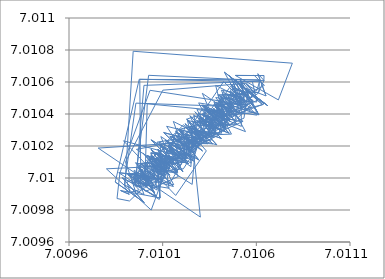
| Category | z(i+1) |
|---|---|
| 7.010587038041048 | 7.011 |
| 7.010643327215147 | 7.011 |
| 7.010578920234985 | 7.011 |
| 7.010539316386497 | 7.011 |
| 7.010529685065966 | 7.01 |
| 7.01048511235162 | 7.011 |
| 7.010531497682768 | 7.011 |
| 7.010518934696032 | 7.011 |
| 7.010608680972494 | 7.01 |
| 7.010486922249727 | 7.01 |
| 7.010425552691462 | 7.011 |
| 7.010510290310243 | 7.01 |
| 7.010467754568153 | 7.011 |
| 7.0105342815099245 | 7.01 |
| 7.010482627822763 | 7.011 |
| 7.010520934503475 | 7.01 |
| 7.0104550334090545 | 7.01 |
| 7.010437948309654 | 7.01 |
| 7.010395726426616 | 7.01 |
| 7.010433253508828 | 7.01 |
| 7.010313910743665 | 7.01 |
| 7.0104566181116565 | 7.01 |
| 7.010371916823228 | 7.01 |
| 7.010429063393958 | 7.01 |
| 7.010368888384199 | 7.01 |
| 7.010298493454005 | 7.01 |
| 7.010246157922763 | 7.01 |
| 7.010389206918105 | 7.01 |
| 7.01020742385024 | 7.01 |
| 7.010264531420542 | 7.01 |
| 7.010105466889015 | 7.01 |
| 7.010283849636569 | 7.01 |
| 7.010228531307917 | 7.01 |
| 7.010138480833361 | 7.01 |
| 7.010169743061649 | 7.01 |
| 7.010279718385664 | 7.01 |
| 7.010257574999105 | 7.01 |
| 7.009959973471053 | 7.01 |
| 7.0101787238343904 | 7.01 |
| 7.010229509519602 | 7.01 |
| 7.010223253593631 | 7.01 |
| 7.010108894947646 | 7.01 |
| 7.010120699438486 | 7.01 |
| 7.010145207186079 | 7.01 |
| 7.010187337129556 | 7.01 |
| 7.0100892254917175 | 7.01 |
| 7.010098729639178 | 7.01 |
| 7.010141625344139 | 7.01 |
| 7.010077050707058 | 7.01 |
| 7.009937034837109 | 7.01 |
| 7.009976632146876 | 7.01 |
| 7.010053858964201 | 7.01 |
| 7.009955797058401 | 7.01 |
| 7.0100953105103 | 7.01 |
| 7.010047977047843 | 7.01 |
| 7.010070786928096 | 7.01 |
| 7.009924279627846 | 7.01 |
| 7.010022615783295 | 7.01 |
| 7.010006004766696 | 7.01 |
| 7.009958281921703 | 7.01 |
| 7.010024969775642 | 7.011 |
| 7.010641812797588 | 7.011 |
| 7.01060824835951 | 7.011 |
| 7.01065153703241 | 7.011 |
| 7.010513093086659 | 7.011 |
| 7.010574665085311 | 7.01 |
| 7.010482926860968 | 7.01 |
| 7.01046231978634 | 7.011 |
| 7.010519935114501 | 7.01 |
| 7.010466435515652 | 7.011 |
| 7.010583279425339 | 7.01 |
| 7.0104826519918255 | 7.01 |
| 7.010399463564785 | 7.01 |
| 7.010387724492041 | 7.01 |
| 7.010348858879402 | 7.01 |
| 7.010335392361106 | 7.01 |
| 7.010373603038712 | 7.01 |
| 7.0104369377103986 | 7.01 |
| 7.010302820439571 | 7.01 |
| 7.010231185524427 | 7.01 |
| 7.010369226284913 | 7.01 |
| 7.0104190671301145 | 7.01 |
| 7.0103001905441955 | 7.01 |
| 7.010332700625465 | 7.01 |
| 7.0104228516629155 | 7.01 |
| 7.010398788200551 | 7.01 |
| 7.010267705521836 | 7.01 |
| 7.010194156969123 | 7.01 |
| 7.010305459843556 | 7.01 |
| 7.010338911100393 | 7.01 |
| 7.0103216852489805 | 7.01 |
| 7.01029991531808 | 7.01 |
| 7.01027045923402 | 7.01 |
| 7.010304170550452 | 7.01 |
| 7.010226123268269 | 7.01 |
| 7.010232419337659 | 7.01 |
| 7.010294975623724 | 7.01 |
| 7.01021044683564 | 7.01 |
| 7.010057297098649 | 7.01 |
| 7.010036677768495 | 7.01 |
| 7.010158440049685 | 7.01 |
| 7.010126760980391 | 7.01 |
| 7.01009373981963 | 7.01 |
| 7.010088687488498 | 7.01 |
| 7.010038056587904 | 7.01 |
| 7.010155118085034 | 7.01 |
| 7.01012982551234 | 7.01 |
| 7.0101021996781965 | 7.01 |
| 7.010037829703696 | 7.01 |
| 7.010139984423158 | 7.01 |
| 7.010057530030242 | 7.01 |
| 7.01008054565539 | 7.01 |
| 7.010033147304555 | 7.01 |
| 7.010092876875664 | 7.01 |
| 7.010060486070184 | 7.01 |
| 7.009956200502049 | 7.01 |
| 7.009948002367624 | 7.01 |
| 7.010048667717958 | 7.01 |
| 7.00996831956194 | 7.01 |
| 7.010000802879566 | 7.01 |
| 7.009895566122015 | 7.01 |
| 7.009957094622581 | 7.01 |
| 7.010467947735872 | 7.01 |
| 7.010446881885459 | 7.011 |
| 7.010518820720169 | 7.01 |
| 7.010492231214578 | 7.011 |
| 7.0106125244444 | 7.01 |
| 7.010396300379371 | 7.01 |
| 7.010481422437366 | 7.01 |
| 7.010396290194616 | 7.01 |
| 7.010462723295965 | 7.011 |
| 7.010574157080678 | 7.01 |
| 7.010444024154563 | 7.01 |
| 7.01036392164641 | 7.01 |
| 7.010398182994527 | 7.01 |
| 7.010445698766001 | 7.01 |
| 7.010381496185571 | 7.01 |
| 7.010461108375663 | 7.01 |
| 7.010431242860154 | 7.01 |
| 7.010314656450992 | 7.01 |
| 7.010403743802617 | 7.01 |
| 7.01029950012435 | 7.01 |
| 7.010385063862097 | 7.01 |
| 7.010305251439538 | 7.01 |
| 7.010312150979389 | 7.01 |
| 7.010292927279273 | 7.01 |
| 7.010372635589984 | 7.01 |
| 7.010252792736317 | 7.01 |
| 7.010311271639136 | 7.01 |
| 7.010272013853997 | 7.01 |
| 7.010311961047101 | 7.01 |
| 7.01021482289618 | 7.01 |
| 7.0101383302736755 | 7.01 |
| 7.010261967664402 | 7.01 |
| 7.010181341588 | 7.01 |
| 7.010130731523006 | 7.01 |
| 7.010219634457745 | 7.01 |
| 7.010156897437225 | 7.01 |
| 7.010353413669293 | 7.01 |
| 7.010237776401327 | 7.01 |
| 7.010182236174942 | 7.01 |
| 7.010160400661498 | 7.01 |
| 7.010230819873296 | 7.01 |
| 7.0102499077989835 | 7.01 |
| 7.0101540883108155 | 7.01 |
| 7.010081427058132 | 7.01 |
| 7.0102249818484585 | 7.01 |
| 7.010136487767999 | 7.01 |
| 7.009963761432418 | 7.01 |
| 7.010086455646246 | 7.01 |
| 7.010109400250409 | 7.01 |
| 7.010009512378678 | 7.01 |
| 7.010070041326533 | 7.01 |
| 7.010159473037676 | 7.01 |
| 7.00995697727209 | 7.01 |
| 7.010021050483567 | 7.01 |
| 7.009991340397008 | 7.01 |
| 7.009947454520704 | 7.01 |
| 7.009956157727174 | 7.01 |
| 7.010038935917469 | 7.01 |
| 7.009995244760927 | 7.01 |
| 7.009958378540802 | 7.01 |
| 7.0100001225117134 | 7.011 |
| 7.0105790670494805 | 7.011 |
| 7.010602913480632 | 7.01 |
| 7.010475101292086 | 7.01 |
| 7.010482758505321 | 7.011 |
| 7.0105239270952255 | 7.01 |
| 7.010436580044374 | 7.011 |
| 7.010525830474387 | 7.011 |
| 7.010504507746148 | 7.01 |
| 7.010457261601039 | 7.01 |
| 7.010483238885527 | 7.01 |
| 7.01044622760072 | 7.01 |
| 7.010411808431822 | 7.01 |
| 7.010463174020064 | 7.01 |
| 7.010453641509294 | 7.01 |
| 7.010360672316951 | 7.01 |
| 7.01042599485859 | 7.01 |
| 7.010334391301857 | 7.01 |
| 7.010422000790474 | 7.01 |
| 7.010393772835418 | 7.01 |
| 7.010311597296646 | 7.011 |
| 7.010529351630998 | 7.01 |
| 7.010354390320593 | 7.01 |
| 7.010260280393359 | 7.01 |
| 7.010231907872912 | 7.01 |
| 7.010360109616502 | 7.01 |
| 7.010324475649094 | 7.01 |
| 7.010235353525248 | 7.01 |
| 7.010316790121875 | 7.01 |
| 7.010330989102595 | 7.01 |
| 7.010259153414619 | 7.01 |
| 7.010237542519682 | 7.01 |
| 7.010234240580488 | 7.01 |
| 7.010121023113417 | 7.01 |
| 7.010323190161487 | 7.01 |
| 7.010264780281923 | 7.01 |
| 7.010157461562569 | 7.01 |
| 7.010217109214911 | 7.01 |
| 7.01019873659256 | 7.01 |
| 7.010084231486962 | 7.01 |
| 7.010109576517738 | 7.01 |
| 7.01007418580502 | 7.01 |
| 7.010180767229428 | 7.01 |
| 7.010037108798016 | 7.01 |
| 7.010058478591785 | 7.01 |
| 7.010012907252792 | 7.01 |
| 7.009992277135652 | 7.01 |
| 7.010009897770125 | 7.01 |
| 7.010074676759051 | 7.01 |
| 7.010078035926422 | 7.01 |
| 7.010127298850967 | 7.01 |
| 7.010028857438644 | 7.01 |
| 7.009981295511998 | 7.01 |
| 7.0100570038542225 | 7.01 |
| 7.009908810178609 | 7.01 |
| 7.01002801507314 | 7.01 |
| 7.010024583689063 | 7.01 |
| 7.009981908720746 | 7.01 |
| 7.009922769956195 | 7.01 |
| 7.009856326928386 | 7.01 |
| 7.00987176127262 | 7.01 |
| 7.0100325822748495 | 7.011 |
| 7.010548117582207 | 7.01 |
| 7.010455926548426 | 7.01 |
| 7.010464285883145 | 7.011 |
| 7.010554482304925 | 7.011 |
| 7.010533971990029 | 7.01 |
| 7.010373938142032 | 7.01 |
| 7.010292087344691 | 7.01 |
| 7.010469415745927 | 7.01 |
| 7.010434903326599 | 7.01 |
| 7.010403214353692 | 7.01 |
| 7.010459300405065 | 7.01 |
| 7.010354028360672 | 7.01 |
| 7.010416710260087 | 7.01 |
| 7.010420373063651 | 7.01 |
| 7.010438585067835 | 7.01 |
| 7.010308242773562 | 7.01 |
| 7.010455581019231 | 7.01 |
| 7.01028004536588 | 7.01 |
| 7.010357047183677 | 7.01 |
| 7.010348419924624 | 7.01 |
| 7.010358369522481 | 7.01 |
| 7.010359406614006 | 7.01 |
| 7.010236202716032 | 7.01 |
| 7.010225550214664 | 7.01 |
| 7.010275491526369 | 7.01 |
| 7.010251516638451 | 7.01 |
| 7.0101673764273995 | 7.01 |
| 7.010238311139316 | 7.01 |
| 7.010245564824851 | 7.01 |
| 7.010215140059892 | 7.01 |
| 7.010134464059751 | 7.01 |
| 7.010202849997196 | 7.01 |
| 7.010293839778315 | 7.01 |
| 7.010214291122661 | 7.01 |
| 7.0101764611942095 | 7.01 |
| 7.01011681375534 | 7.01 |
| 7.010122923603423 | 7.01 |
| 7.0101140881920605 | 7.01 |
| 7.0100387165111275 | 7.01 |
| 7.009799727459158 | 7.01 |
| 7.010057345851478 | 7.01 |
| 7.010071667725033 | 7.01 |
| 7.010026010971087 | 7.01 |
| 7.01013325112015 | 7.01 |
| 7.010094094023453 | 7.01 |
| 7.009987282828809 | 7.01 |
| 7.0100239533795214 | 7.01 |
| 7.010013988968906 | 7.01 |
| 7.010095719387972 | 7.01 |
| 7.010081832346702 | 7.01 |
| 7.009865786448373 | 7.01 |
| 7.0100332393361 | 7.01 |
| 7.010009284269831 | 7.01 |
| 7.009973867713382 | 7.01 |
| 7.010076260665225 | 7.01 |
| 7.01006994261567 | 7.01 |
| 7.010086845269707 | 7.01 |
| 7.009875362537391 | 7.01 |
| 7.009921645086507 | 7.01 |
| 7.009898124876231 | 7.01 |
| 7.009942623222054 | 7.011 |
| 7.010792275678864 | 7.011 |
| 7.0107176743448765 | 7.01 |
| 7.010488013563768 | 7.011 |
| 7.0106410997671285 | 7.011 |
| 7.010640208484257 | 7.011 |
| 7.010607737600374 | 7.011 |
| 7.01052739001309 | 7.01 |
| 7.010470294146118 | 7.011 |
| 7.010564738106824 | 7.011 |
| 7.010529320202302 | 7.011 |
| 7.010500793927545 | 7.01 |
| 7.010477592486363 | 7.011 |
| 7.0106071375785195 | 7.01 |
| 7.010412636609787 | 7.01 |
| 7.010387242330739 | 7.01 |
| 7.01047393271595 | 7.01 |
| 7.010463440101452 | 7.01 |
| 7.010487482178446 | 7.011 |
| 7.01051344888109 | 7.01 |
| 7.010401787468336 | 7.011 |
| 7.010517353137183 | 7.01 |
| 7.010352177939615 | 7.01 |
| 7.010393194594084 | 7.01 |
| 7.010425007525072 | 7.011 |
| 7.010542136881628 | 7.01 |
| 7.01028976546843 | 7.01 |
| 7.010402765462729 | 7.01 |
| 7.010368210467527 | 7.01 |
| 7.010256680890552 | 7.01 |
| 7.010257362334616 | 7.01 |
| 7.010322739485018 | 7.01 |
| 7.01027774227565 | 7.01 |
| 7.010301364210131 | 7.01 |
| 7.010283055851092 | 7.01 |
| 7.010252161251563 | 7.01 |
| 7.0103011643093325 | 7.01 |
| 7.009755767206765 | 7.01 |
| 7.010187069090205 | 7.01 |
| 7.010219109763721 | 7.01 |
| 7.010317066801882 | 7.01 |
| 7.010245936761422 | 7.01 |
| 7.01025337434841 | 7.01 |
| 7.01025113426333 | 7.01 |
| 7.010070787547767 | 7.01 |
| 7.010224133087433 | 7.01 |
| 7.010252675734048 | 7.01 |
| 7.010093099324668 | 7.01 |
| 7.01019201360369 | 7.01 |
| 7.0101342547760215 | 7.01 |
| 7.010187135140249 | 7.01 |
| 7.010066757844496 | 7.01 |
| 7.010014367820356 | 7.01 |
| 7.0101113141317954 | 7.01 |
| 7.010133710202446 | 7.01 |
| 7.00993608693878 | 7.01 |
| 7.0099742027912555 | 7.01 |
| 7.009926356170955 | 7.01 |
| 7.009909486439944 | 7.01 |
| 7.009974555298643 | 7.01 |
| 7.0100065385873656 | 7.01 |
| 7.010017486472823 | 7.01 |
| 7.010463699884877 | 7.01 |
| 7.010413324100574 | 7.011 |
| 7.010548544259244 | 7.011 |
| 7.0105222137498355 | 7.011 |
| 7.01052318058846 | 7.011 |
| 7.010543178664169 | 7.01 |
| 7.0104496778517005 | 7.01 |
| 7.010407973246695 | 7.01 |
| 7.010374081940525 | 7.01 |
| 7.010475176224363 | 7.01 |
| 7.010424488728528 | 7.01 |
| 7.010382966876956 | 7.011 |
| 7.010578402960183 | 7.01 |
| 7.010464915348337 | 7.01 |
| 7.0103335861494465 | 7.01 |
| 7.0103230470201785 | 7.01 |
| 7.010416168378607 | 7.01 |
| 7.010280548829041 | 7.01 |
| 7.010273836398235 | 7.01 |
| 7.010293856280095 | 7.01 |
| 7.0102696336848735 | 7.01 |
| 7.010288570762524 | 7.01 |
| 7.01026563933168 | 7.01 |
| 7.010395600774797 | 7.01 |
| 7.010278246313484 | 7.01 |
| 7.010297675842707 | 7.01 |
| 7.010317352115997 | 7.01 |
| 7.010248260686714 | 7.01 |
| 7.010190236205292 | 7.01 |
| 7.010304699144759 | 7.01 |
| 7.010259663798031 | 7.01 |
| 7.0101082945867494 | 7.01 |
| 7.010212115413555 | 7.01 |
| 7.010333104563807 | 7.01 |
| 7.010169393379755 | 7.01 |
| 7.009890960694523 | 7.01 |
| 7.010232449889799 | 7.01 |
| 7.010124041700515 | 7.01 |
| 7.010115614470765 | 7.01 |
| 7.01012163384884 | 7.01 |
| 7.010173687704287 | 7.01 |
| 7.010058281350034 | 7.01 |
| 7.010113096661637 | 7.01 |
| 7.0100399811464715 | 7.01 |
| 7.01011506023802 | 7.01 |
| 7.010123132790411 | 7.01 |
| 7.010052837380022 | 7.01 |
| 7.00999640687714 | 7.01 |
| 7.010078656886195 | 7.01 |
| 7.01016157932904 | 7.01 |
| 7.010107222279632 | 7.01 |
| 7.010097255134112 | 7.01 |
| 7.010053069292707 | 7.01 |
| 7.010085440967871 | 7.01 |
| 7.010070271574279 | 7.01 |
| 7.009971722926434 | 7.01 |
| 7.009961632478567 | 7.01 |
| 7.010028415047807 | 7.01 |
| 7.009959153568344 | 7.01 |
| 7.009901562293483 | 7.01 |
| 7.010100891008658 | 7.011 |
| 7.010548959177073 | 7.011 |
| 7.010592244091254 | 7.011 |
| 7.010528386342053 | 7.01 |
| 7.01046188732803 | 7.011 |
| 7.010633416030365 | 7.01 |
| 7.010458330752721 | 7.01 |
| 7.010407186071552 | 7.01 |
| 7.010457977843882 | 7.01 |
| 7.010466667836995 | 7.01 |
| 7.010378671371781 | 7.01 |
| 7.010446095001975 | 7.01 |
| 7.010374309016351 | 7.01 |
| 7.010458218921054 | 7.01 |
| 7.010332273077988 | 7.01 |
| 7.01043800322148 | 7.01 |
| 7.010353173952267 | 7.01 |
| 7.010282827247572 | 7.01 |
| 7.010427634331483 | 7.01 |
| 7.0104088147011785 | 7.01 |
| 7.01032846186169 | 7.01 |
| 7.010371765011636 | 7.01 |
| 7.010363141377974 | 7.01 |
| 7.0103486909720925 | 7.01 |
| 7.010268655436234 | 7.01 |
| 7.01034599797131 | 7.01 |
| 7.0103522797951605 | 7.01 |
| 7.010281512321819 | 7.01 |
| 7.010219336285453 | 7.01 |
| 7.010339447521465 | 7.01 |
| 7.01021437307498 | 7.01 |
| 7.010216952064863 | 7.01 |
| 7.010134027688213 | 7.01 |
| 7.01015331904992 | 7.01 |
| 7.010190229513221 | 7.01 |
| 7.010148644929552 | 7.01 |
| 7.010090358810969 | 7.01 |
| 7.010258895403185 | 7.01 |
| 7.010129104875291 | 7.01 |
| 7.010193645629897 | 7.01 |
| 7.010125496158933 | 7.01 |
| 7.010137502476682 | 7.01 |
| 7.010058641407319 | 7.01 |
| 7.0101597756952225 | 7.01 |
| 7.010120523049316 | 7.01 |
| 7.010109443284843 | 7.01 |
| 7.010114246014655 | 7.01 |
| 7.010112911741705 | 7.01 |
| 7.009995203303124 | 7.01 |
| 7.0101565297193495 | 7.01 |
| 7.009947352239156 | 7.01 |
| 7.010014219890829 | 7.01 |
| 7.010073207659381 | 7.01 |
| 7.009984027710763 | 7.01 |
| 7.010091363300267 | 7.01 |
| 7.010093560853777 | 7.01 |
| 7.009969013995855 | 7.01 |
| 7.010065369110936 | 7.01 |
| 7.009884592089786 | 7.01 |
| 7.010001743337265 | 7.01 |
| 7.009846869202345 | 7.01 |
| 7.009974893673008 | 7.011 |
| 7.010617204286512 | 7.011 |
| 7.010602135481449 | 7.011 |
| 7.010545883587343 | 7.011 |
| 7.010585719212385 | 7.011 |
| 7.010538287814334 | 7.01 |
| 7.010429065123557 | 7.011 |
| 7.010661569304342 | 7.01 |
| 7.01045127176492 | 7.011 |
| 7.010640993087122 | 7.01 |
| 7.01046301382051 | 7.01 |
| 7.010383244677823 | 7.011 |
| 7.010502404179726 | 7.01 |
| 7.0104891997606815 | 7.01 |
| 7.010366709266927 | 7.01 |
| 7.010359208433187 | 7.01 |
| 7.010377144687482 | 7.01 |
| 7.010272428317482 | 7.01 |
| 7.010413450600985 | 7.01 |
| 7.0102474900642875 | 7.01 |
| 7.010313716614191 | 7.01 |
| 7.010434876257186 | 7.01 |
| 7.0103151416464575 | 7.01 |
| 7.010390808121269 | 7.01 |
| 7.010360637921505 | 7.01 |
| 7.010432699831962 | 7.01 |
| 7.010291015019761 | 7.01 |
| 7.01037451266903 | 7.01 |
| 7.010340302114955 | 7.01 |
| 7.010351474585066 | 7.01 |
| 7.010330562617676 | 7.01 |
| 7.01022796707657 | 7.01 |
| 7.010274713720032 | 7.01 |
| 7.010176633388972 | 7.01 |
| 7.010312241912804 | 7.01 |
| 7.010169554217163 | 7.01 |
| 7.010292745158448 | 7.01 |
| 7.010113240064103 | 7.01 |
| 7.010235036845063 | 7.01 |
| 7.0100996295837215 | 7.01 |
| 7.010089258219964 | 7.01 |
| 7.010087622871091 | 7.01 |
| 7.010208618531766 | 7.01 |
| 7.010132497603582 | 7.01 |
| 7.010099249571041 | 7.01 |
| 7.010040095423601 | 7.01 |
| 7.0101385735698845 | 7.01 |
| 7.010017869532706 | 7.01 |
| 7.010140288523828 | 7.01 |
| 7.010083306129616 | 7.01 |
| 7.009994268827404 | 7.01 |
| 7.009999057708437 | 7.01 |
| 7.010012297877358 | 7.01 |
| 7.01005922585794 | 7.01 |
| 7.010101952433736 | 7.01 |
| 7.010183711396748 | 7.01 |
| 7.010009633884966 | 7.01 |
| 7.009916423321627 | 7.01 |
| 7.010018659302395 | 7.01 |
| 7.009951162432703 | 7.01 |
| 7.009983457794906 | 7.01 |
| 7.009977752305508 | 7.011 |
| 7.010616288623976 | 7.011 |
| 7.010613898256636 | 7.011 |
| 7.010535263206508 | 7.011 |
| 7.010530760293012 | 7.011 |
| 7.0105364695206625 | 7.011 |
| 7.010514210931451 | 7.011 |
| 7.010613538421696 | 7.01 |
| 7.010394502761033 | 7.011 |
| 7.01051875712879 | 7.011 |
| 7.010519919579861 | 7.01 |
| 7.010322471153273 | 7.01 |
| 7.010425553216265 | 7.011 |
| 7.010602778547473 | 7.01 |
| 7.010392742397417 | 7.01 |
| 7.01043284329297 | 7.011 |
| 7.010507796045359 | 7.01 |
| 7.01040317346206 | 7.01 |
| 7.010496928601989 | 7.01 |
| 7.010333121871792 | 7.01 |
| 7.01033384881166 | 7.01 |
| 7.010379375766579 | 7.01 |
| 7.01046730787894 | 7.01 |
| 7.010274335947246 | 7.01 |
| 7.010265129663863 | 7.01 |
| 7.010352610468245 | 7.01 |
| 7.010268241749032 | 7.01 |
| 7.010270223790987 | 7.01 |
| 7.010317628082823 | 7.01 |
| 7.010228407632617 | 7.01 |
| 7.010367613012622 | 7.01 |
| 7.010213012763123 | 7.01 |
| 7.010226474157976 | 7.01 |
| 7.010287798052292 | 7.01 |
| 7.010280838951893 | 7.01 |
| 7.010224869986809 | 7.01 |
| 7.010170614164385 | 7.01 |
| 7.010267595937522 | 7.01 |
| 7.010151813371332 | 7.01 |
| 7.010259649347973 | 7.01 |
| 7.010170247436355 | 7.01 |
| 7.010192934287679 | 7.01 |
| 7.010130591348998 | 7.01 |
| 7.010207829882359 | 7.01 |
| 7.010038715225138 | 7.01 |
| 7.010238338601954 | 7.01 |
| 7.010090551135232 | 7.01 |
| 7.010136638314296 | 7.01 |
| 7.010081246881033 | 7.01 |
| 7.010145186917465 | 7.01 |
| 7.010070674487756 | 7.01 |
| 7.010116306440138 | 7.01 |
| 7.01003823938707 | 7.01 |
| 7.010179399539017 | 7.01 |
| 7.010032967183541 | 7.01 |
| 7.010045551539152 | 7.01 |
| 7.009938461729496 | 7.01 |
| 7.010025914819892 | 7.01 |
| 7.01000086464116 | 7.01 |
| 7.0100513533583015 | 7.01 |
| 7.010014569975997 | 7.01 |